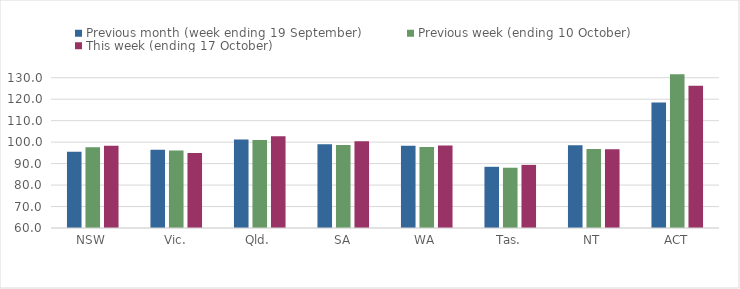
| Category | Previous month (week ending 19 September) | Previous week (ending 10 October) | This week (ending 17 October) |
|---|---|---|---|
| NSW | 95.47 | 97.61 | 98.29 |
| Vic. | 96.43 | 96.08 | 94.95 |
| Qld. | 101.23 | 101.02 | 102.75 |
| SA | 98.99 | 98.71 | 100.46 |
| WA | 98.32 | 97.7 | 98.45 |
| Tas. | 88.51 | 88.08 | 89.4 |
| NT | 98.49 | 96.76 | 96.71 |
| ACT | 118.42 | 131.58 | 126.32 |